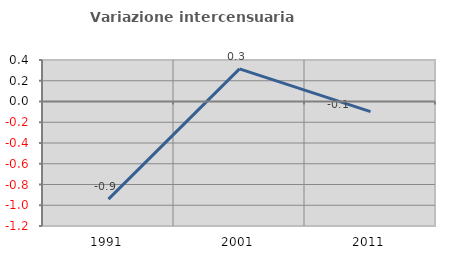
| Category | Variazione intercensuaria annua |
|---|---|
| 1991.0 | -0.941 |
| 2001.0 | 0.314 |
| 2011.0 | -0.097 |